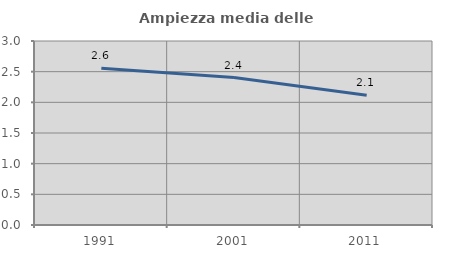
| Category | Ampiezza media delle famiglie |
|---|---|
| 1991.0 | 2.557 |
| 2001.0 | 2.404 |
| 2011.0 | 2.115 |